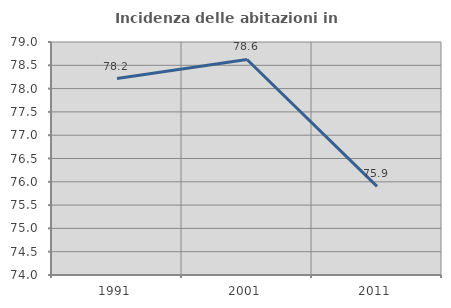
| Category | Incidenza delle abitazioni in proprietà  |
|---|---|
| 1991.0 | 78.216 |
| 2001.0 | 78.626 |
| 2011.0 | 75.902 |